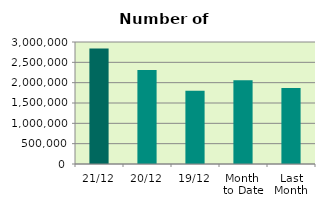
| Category | Series 0 |
|---|---|
| 21/12 | 2842130 |
| 20/12 | 2311150 |
| 19/12 | 1803424 |
| Month 
to Date | 2056734.267 |
| Last
Month | 1871523.909 |